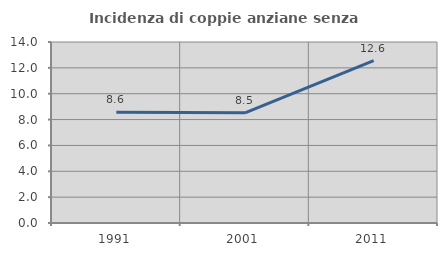
| Category | Incidenza di coppie anziane senza figli  |
|---|---|
| 1991.0 | 8.566 |
| 2001.0 | 8.518 |
| 2011.0 | 12.562 |